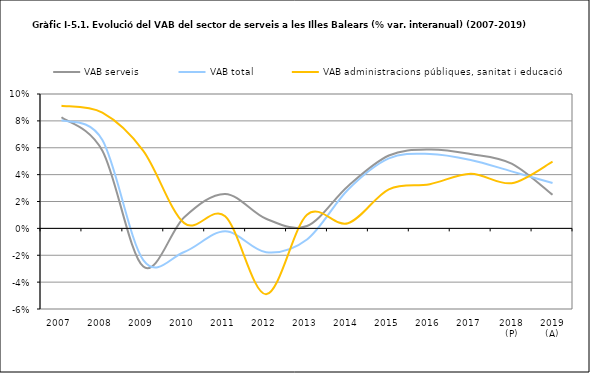
| Category | VAB serveis | VAB total | VAB administracions públiques, sanitat i educació |
|---|---|---|---|
| 2007 | 0.083 | 0.08 | 0.091 |
| 2008 | 0.058 | 0.066 | 0.086 |
| 2009 | -0.028 | -0.024 | 0.058 |
| 2010 | 0.008 | -0.018 | 0.004 |
| 2011 | 0.026 | -0.002 | 0.009 |
| 2012 | 0.007 | -0.018 | -0.049 |
| 2013 | 0.002 | -0.008 | 0.01 |
| 2014 | 0.031 | 0.029 | 0.004 |
| 2015 | 0.054 | 0.052 | 0.029 |
| 2016 | 0.059 | 0.055 | 0.033 |
| 2017 | 0.055 | 0.051 | 0.041 |
| 2018 (P) | 0.048 | 0.042 | 0.034 |
| 2019 (A) | 0.025 | 0.034 | 0.05 |